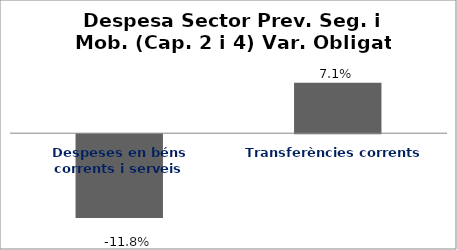
| Category | Series 0 |
|---|---|
| Despeses en béns corrents i serveis | -0.118 |
| Transferències corrents | 0.071 |